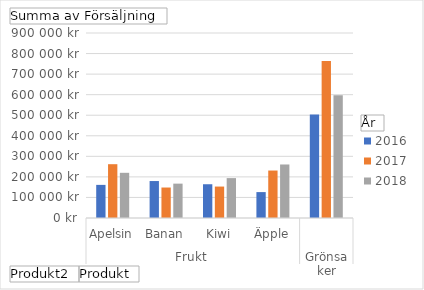
| Category | 2016 | 2017 | 2018 |
|---|---|---|---|
| 0 | 161118 | 261746 | 219834 |
| 1 | 179813 | 148282 | 167186 |
| 2 | 164249 | 152959 | 194076 |
| 3 | 126031 | 230909 | 260350 |
| 4 | 502957 | 763707 | 596771 |